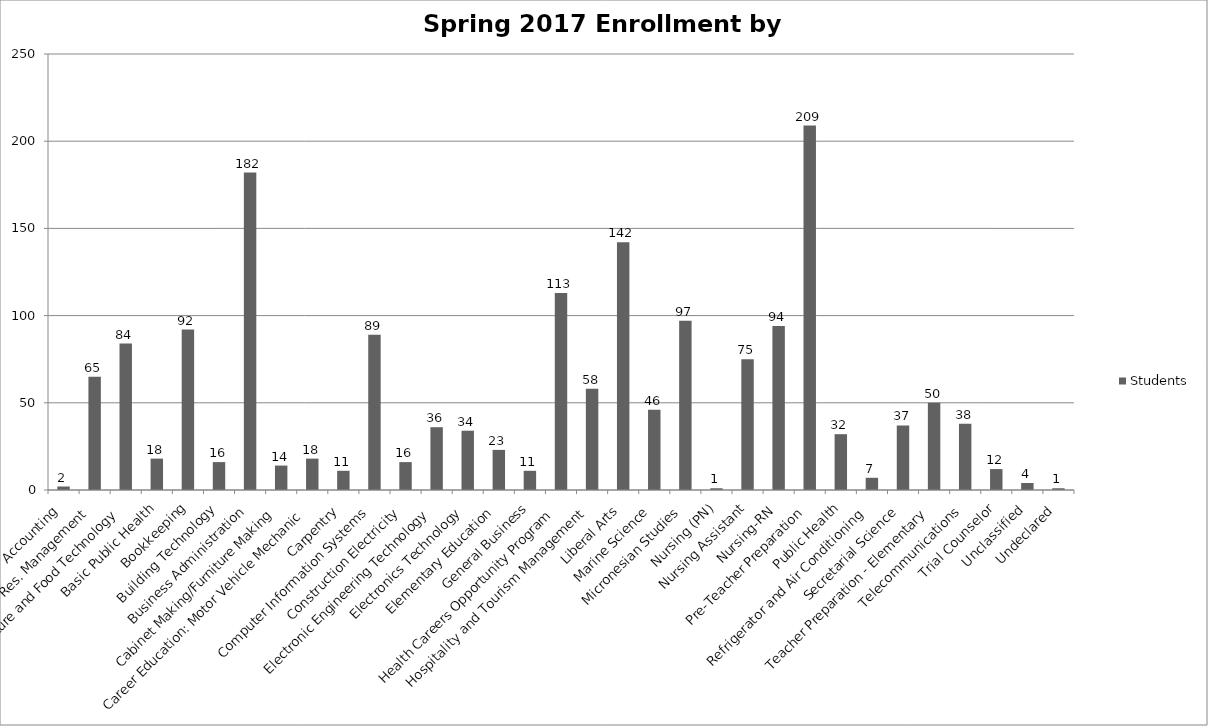
| Category | Students |
|---|---|
| Accounting | 2 |
| Ag. & Nat. Res. Management | 65 |
| Agriculture and Food Technology | 84 |
| Basic Public Health | 18 |
| Bookkeeping | 92 |
| Building Technology | 16 |
| Business Administration | 182 |
| Cabinet Making/Furniture Making | 14 |
| Career Education: Motor Vehicle Mechanic | 18 |
| Carpentry | 11 |
| Computer Information Systems | 89 |
| Construction Electricity | 16 |
| Electronic Engineering Technology | 36 |
| Electronics Technology | 34 |
| Elementary Education | 23 |
| General Business | 11 |
| Health Careers Opportunity Program | 113 |
| Hospitality and Tourism Management | 58 |
| Liberal Arts | 142 |
| Marine Science | 46 |
| Micronesian Studies | 97 |
| Nursing (PN) | 1 |
| Nursing Assistant | 75 |
| Nursing-RN | 94 |
| Pre-Teacher Preparation | 209 |
| Public Health | 32 |
| Refrigerator and Air Conditioning | 7 |
| Secretarial Science | 37 |
| Teacher Preparation - Elementary | 50 |
| Telecommunications | 38 |
| Trial Counselor | 12 |
| Unclassified | 4 |
| Undeclared | 1 |